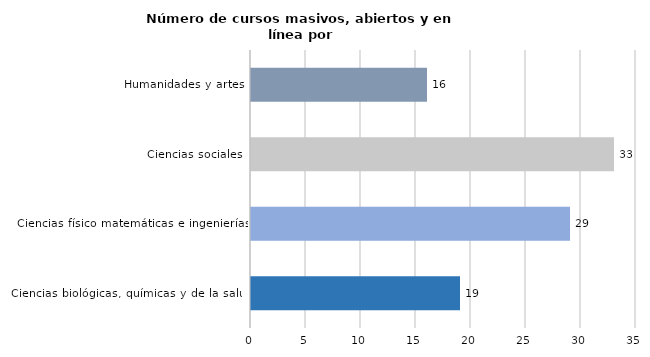
| Category | Series 0 |
|---|---|
| Ciencias biológicas, químicas y de la salud | 19 |
| Ciencias físico matemáticas e ingenierías | 29 |
| Ciencias sociales | 33 |
| Humanidades y artes | 16 |